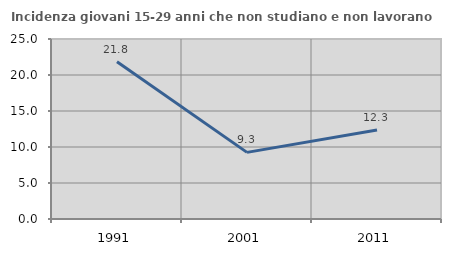
| Category | Incidenza giovani 15-29 anni che non studiano e non lavorano  |
|---|---|
| 1991.0 | 21.845 |
| 2001.0 | 9.254 |
| 2011.0 | 12.349 |